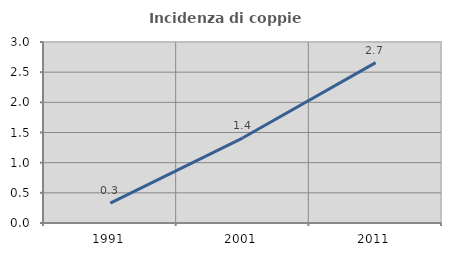
| Category | Incidenza di coppie miste |
|---|---|
| 1991.0 | 0.33 |
| 2001.0 | 1.412 |
| 2011.0 | 2.658 |